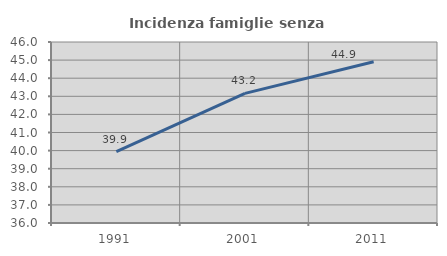
| Category | Incidenza famiglie senza nuclei |
|---|---|
| 1991.0 | 39.949 |
| 2001.0 | 43.16 |
| 2011.0 | 44.907 |